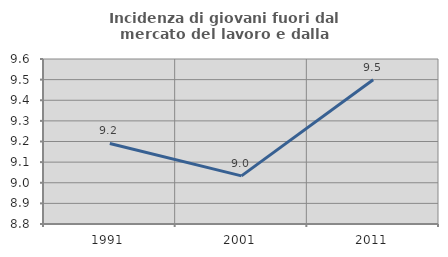
| Category | Incidenza di giovani fuori dal mercato del lavoro e dalla formazione  |
|---|---|
| 1991.0 | 9.191 |
| 2001.0 | 9.033 |
| 2011.0 | 9.499 |